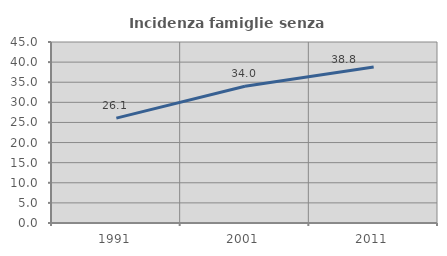
| Category | Incidenza famiglie senza nuclei |
|---|---|
| 1991.0 | 26.077 |
| 2001.0 | 34.004 |
| 2011.0 | 38.794 |